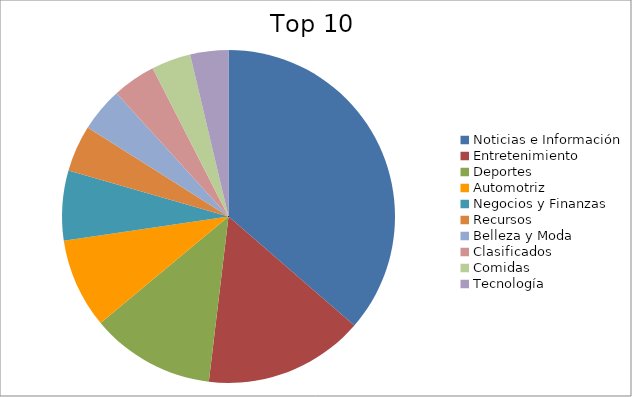
| Category | Series 0 |
|---|---|
| Noticias e Información | 31.61 |
| Entretenimiento | 13.49 |
| Deportes | 10.48 |
| Automotriz | 7.58 |
| Negocios y Finanzas | 5.9 |
| Recursos | 3.92 |
| Belleza y Moda | 3.74 |
| Clasificados | 3.66 |
| Comidas | 3.32 |
| Tecnología | 3.22 |